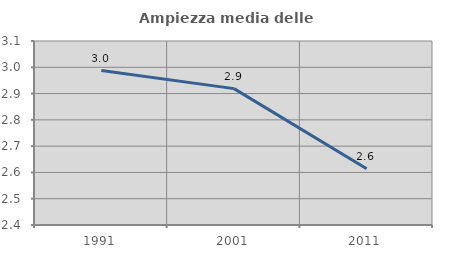
| Category | Ampiezza media delle famiglie |
|---|---|
| 1991.0 | 2.988 |
| 2001.0 | 2.919 |
| 2011.0 | 2.614 |